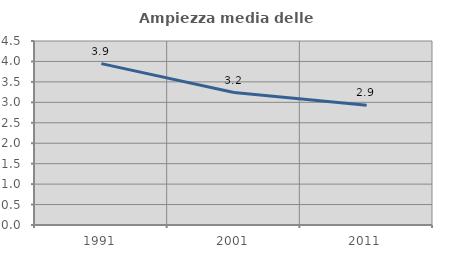
| Category | Ampiezza media delle famiglie |
|---|---|
| 1991.0 | 3.947 |
| 2001.0 | 3.24 |
| 2011.0 | 2.926 |